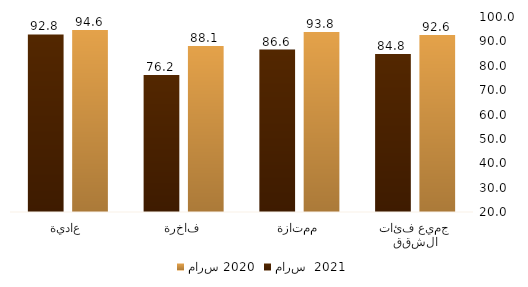
| Category | مارس 2020 | مارس  2021 |
|---|---|---|
| جميع فئات الشقق | 92.63 | 84.822 |
| ممتازة | 93.805 | 86.644 |
| فاخرة | 88.093 | 76.168 |
| عادية | 94.637 | 92.847 |